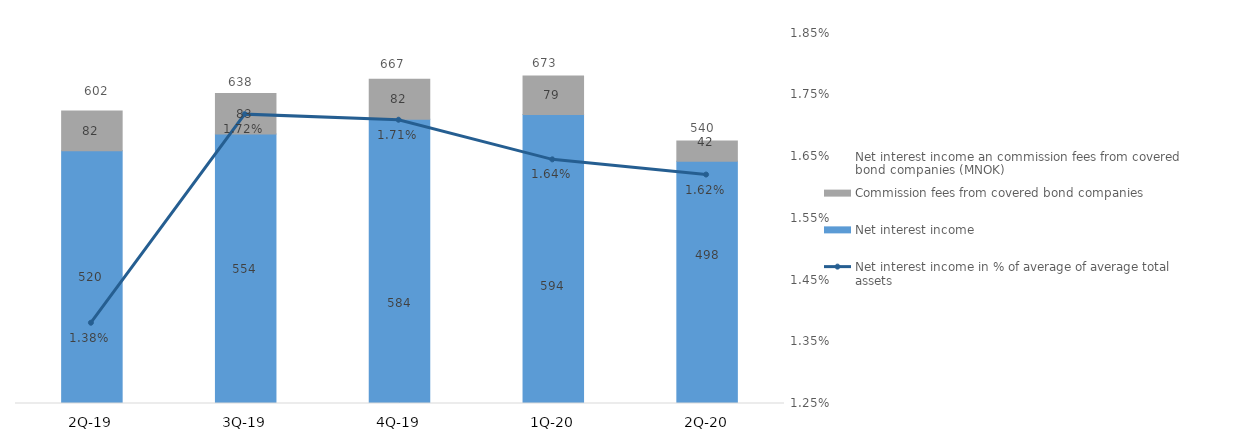
| Category | Net interest income | Commission fees from covered bond companies |
|---|---|---|
| 2Q-20 | 498.097 | 41.55 |
| 1Q-20 | 594.469 | 78.983 |
| 4Q-19 | 584.355 | 82.264 |
| 3Q-19 | 554.269 | 83.345 |
| 2Q-19 | 519.574 | 82.097 |